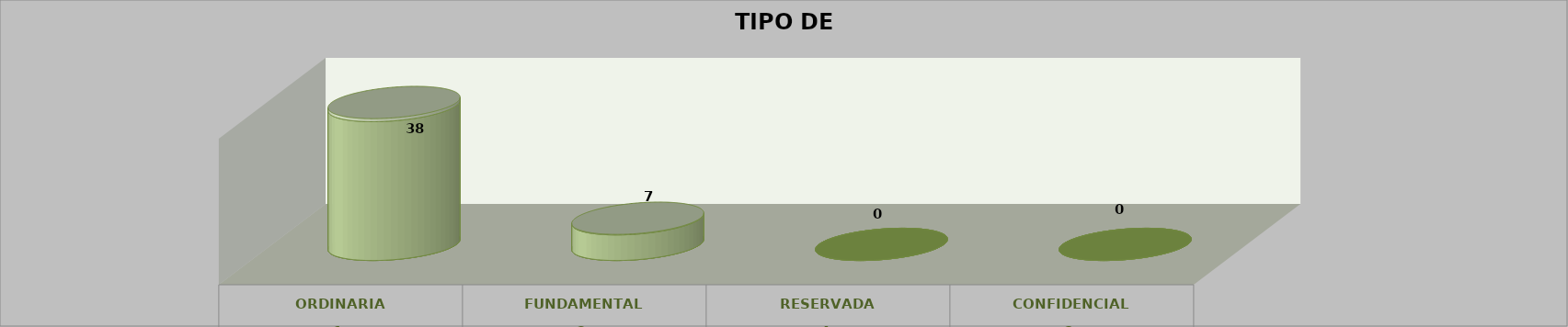
| Category | Series 0 | Series 2 | Series 1 | Series 3 | Series 4 |
|---|---|---|---|---|---|
| 0 |  |  |  | 38 | 0.844 |
| 1 |  |  |  | 7 | 0.156 |
| 2 |  |  |  | 0 | 0 |
| 3 |  |  |  | 0 | 0 |